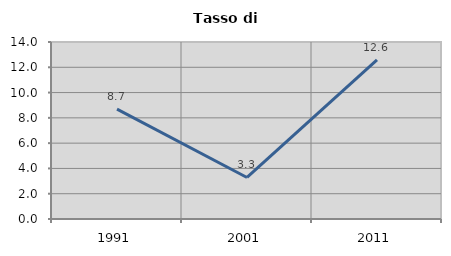
| Category | Tasso di disoccupazione   |
|---|---|
| 1991.0 | 8.696 |
| 2001.0 | 3.285 |
| 2011.0 | 12.59 |